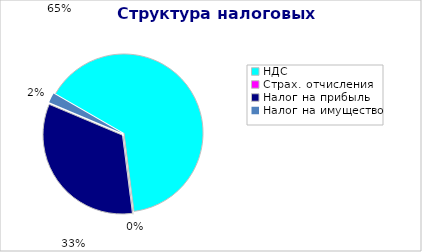
| Category | Series 0 |
|---|---|
| НДС | 4648557606.597 |
| Страх. отчисления | 0 |
| Налог на прибыль | 2399104854.006 |
| Налог на имущество | 143016971.746 |